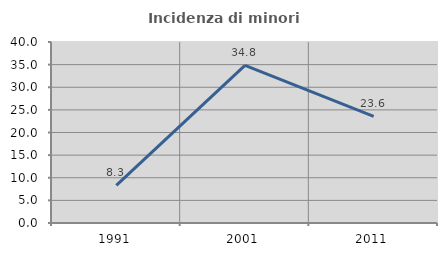
| Category | Incidenza di minori stranieri |
|---|---|
| 1991.0 | 8.333 |
| 2001.0 | 34.848 |
| 2011.0 | 23.563 |